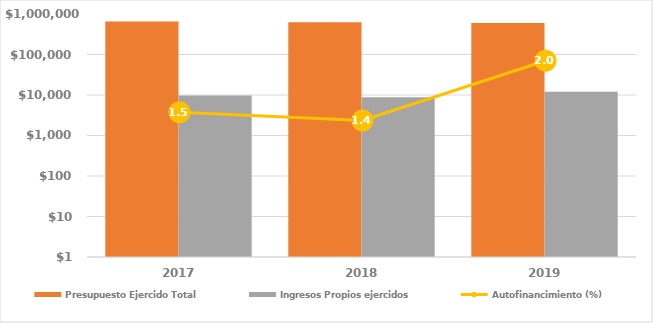
| Category | Presupuesto Ejercido Total | Ingresos Propios ejercidos |
|---|---|---|
| 2017.0 | 653670.792 | 9727.901 |
| 2018.0 | 628799.563 | 8828.859 |
| 2019.0 | 598040.902 | 12076.572 |